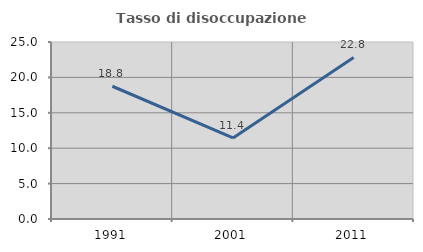
| Category | Tasso di disoccupazione giovanile  |
|---|---|
| 1991.0 | 18.75 |
| 2001.0 | 11.444 |
| 2011.0 | 22.822 |